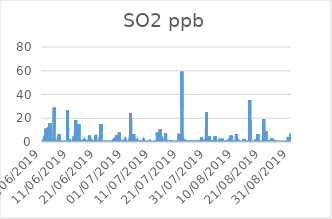
| Category | SO2 |
|---|---|
| 01/06/2019 | 0.2 |
| 01/06/2019 | 0.1 |
| 01/06/2019 | 0.1 |
| 01/06/2019 | 0.1 |
| 01/06/2019 | 0.1 |
| 01/06/2019 | 0.1 |
| 01/06/2019 | 0.2 |
| 01/06/2019 | 0.4 |
| 01/06/2019 | 0.6 |
| 01/06/2019 | 0.9 |
| 01/06/2019 | 0.6 |
| 01/06/2019 | 0.3 |
| 01/06/2019 | 0.3 |
| 01/06/2019 | 0.3 |
| 01/06/2019 | 0.3 |
| 01/06/2019 | 0.3 |
| 01/06/2019 | 0.4 |
| 01/06/2019 | 0.5 |
| 01/06/2019 | 0.4 |
| 01/06/2019 | 1.5 |
| 01/06/2019 | 1.7 |
| 01/06/2019 | 1 |
| 01/06/2019 | 1.2 |
| 01/06/2019 | 1.6 |
| 02/06/2019 | 0.6 |
| 02/06/2019 | 0.6 |
| 02/06/2019 | 1.6 |
| 02/06/2019 | 1 |
| 02/06/2019 | 0.6 |
| 02/06/2019 | 0.5 |
| 02/06/2019 | 0.8 |
| 02/06/2019 | 1.1 |
| 02/06/2019 | 0.8 |
| 02/06/2019 | 6.3 |
| 02/06/2019 | 11.4 |
| 02/06/2019 | 2.9 |
| 02/06/2019 | 0.6 |
| 02/06/2019 | 0.5 |
| 02/06/2019 | 0.3 |
| 02/06/2019 | 0.4 |
| 02/06/2019 | 0.5 |
| 02/06/2019 | 0.7 |
| 02/06/2019 | 0.7 |
| 02/06/2019 | 0.4 |
| 02/06/2019 | 0.4 |
| 02/06/2019 | 1.2 |
| 02/06/2019 | 0.5 |
| 02/06/2019 | 0.4 |
| 03/06/2019 | 0.4 |
| 03/06/2019 | 0.4 |
| 03/06/2019 | 0.3 |
| 03/06/2019 | 0.5 |
| 03/06/2019 | 0.4 |
| 03/06/2019 | 0.3 |
| 03/06/2019 | 0.4 |
| 03/06/2019 | 0.9 |
| 03/06/2019 | 12.4 |
| 03/06/2019 | 2 |
| 03/06/2019 | 0.5 |
| 03/06/2019 | 0.2 |
| 03/06/2019 | 0.2 |
| 03/06/2019 | 9.8 |
| 03/06/2019 | 4.2 |
| 03/06/2019 | 4.9 |
| 03/06/2019 | 0.8 |
| 03/06/2019 | 0.3 |
| 03/06/2019 | 0.6 |
| 03/06/2019 | 2.8 |
| 03/06/2019 | 0.6 |
| 03/06/2019 | 0.9 |
| 03/06/2019 | 4.4 |
| 03/06/2019 | 15.9 |
| 04/06/2019 | 0.7 |
| 04/06/2019 | 0.4 |
| 04/06/2019 | 1.9 |
| 04/06/2019 | 1.3 |
| 04/06/2019 | 0.3 |
| 04/06/2019 | 0.3 |
| 04/06/2019 | 0.4 |
| 04/06/2019 | 0.5 |
| 04/06/2019 | 0.4 |
| 04/06/2019 | 0.4 |
| 04/06/2019 | 0.3 |
| 04/06/2019 | 0.3 |
| 04/06/2019 | 0.2 |
| 04/06/2019 | 0.1 |
| 04/06/2019 | 0.1 |
| 04/06/2019 | 0.1 |
| 04/06/2019 | 0.1 |
| 04/06/2019 | 0.1 |
| 04/06/2019 | 0.1 |
| 04/06/2019 | 0.1 |
| 04/06/2019 | 0.1 |
| 04/06/2019 | 0.2 |
| 04/06/2019 | 0.9 |
| 04/06/2019 | 1.3 |
| 05/06/2019 | 0.4 |
| 05/06/2019 | 0.4 |
| 05/06/2019 | 0.8 |
| 05/06/2019 | 1 |
| 05/06/2019 | 0.9 |
| 05/06/2019 | 0.6 |
| 05/06/2019 | 0.5 |
| 05/06/2019 | 0.7 |
| 05/06/2019 | 0.5 |
| 05/06/2019 | 1 |
| 05/06/2019 | 0.4 |
| 05/06/2019 | 29 |
| 05/06/2019 | 10.6 |
| 05/06/2019 | 0.2 |
| 05/06/2019 | 0.5 |
| 05/06/2019 | 0.3 |
| 05/06/2019 | 0.3 |
| 05/06/2019 | 0.2 |
| 05/06/2019 | 0.3 |
| 05/06/2019 | 0.2 |
| 05/06/2019 | 0.2 |
| 05/06/2019 | 0.2 |
| 05/06/2019 | 0.2 |
| 05/06/2019 | 0.7 |
| 06/06/2019 | 1.5 |
| 06/06/2019 | 1.5 |
| 06/06/2019 | 0.6 |
| 06/06/2019 | 0.5 |
| 06/06/2019 | 1 |
| 06/06/2019 | 0.7 |
| 06/06/2019 | 0.7 |
| 06/06/2019 | 0.7 |
| 06/06/2019 | 0.3 |
| 06/06/2019 | 0.2 |
| 06/06/2019 | 0.3 |
| 06/06/2019 | 0.3 |
| 06/06/2019 | 0.2 |
| 06/06/2019 | 0.2 |
| 06/06/2019 | 0.2 |
| 06/06/2019 | 0.2 |
| 06/06/2019 | 0.6 |
| 06/06/2019 | 0.8 |
| 06/06/2019 | 0.7 |
| 06/06/2019 | 1.2 |
| 06/06/2019 | 0.8 |
| 06/06/2019 | 1.7 |
| 06/06/2019 | 2.8 |
| 06/06/2019 | 3 |
| 07/06/2019 | 3.8 |
| 07/06/2019 | 4.5 |
| 07/06/2019 | 0.5 |
| 07/06/2019 | 0.4 |
| 07/06/2019 | 0.6 |
| 07/06/2019 | 0.7 |
| 07/06/2019 | 1.1 |
| 07/06/2019 | 0.9 |
| 07/06/2019 | 6.5 |
| 07/06/2019 | 1.6 |
| 07/06/2019 | 1.1 |
| 07/06/2019 | 1.5 |
| 07/06/2019 | 0.9 |
| 07/06/2019 | 0.5 |
| 07/06/2019 | 0.3 |
| 07/06/2019 | 0.4 |
| 07/06/2019 | 0.3 |
| 07/06/2019 | 0.3 |
| 07/06/2019 | 0.3 |
| 07/06/2019 | 0.2 |
| 07/06/2019 | 0.2 |
| 07/06/2019 | 0.3 |
| 07/06/2019 | 0.4 |
| 07/06/2019 | 0.4 |
| 08/06/2019 | 0.2 |
| 08/06/2019 | 0.2 |
| 08/06/2019 | 0.3 |
| 08/06/2019 | 0.2 |
| 08/06/2019 | 0.1 |
| 08/06/2019 | 0 |
| 08/06/2019 | 0 |
| 08/06/2019 | 0.1 |
| 08/06/2019 | 0.1 |
| 08/06/2019 | 0.1 |
| 08/06/2019 | 0.1 |
| 08/06/2019 | 0.1 |
| 08/06/2019 | 0.1 |
| 08/06/2019 | 0.1 |
| 08/06/2019 | 0.1 |
| 08/06/2019 | 0.1 |
| 08/06/2019 | 0.2 |
| 08/06/2019 | 0.1 |
| 08/06/2019 | 0.1 |
| 08/06/2019 | 0.1 |
| 08/06/2019 | 0.1 |
| 08/06/2019 | 0.1 |
| 08/06/2019 | 0.2 |
| 08/06/2019 | 0.4 |
| 09/06/2019 | 0.4 |
| 09/06/2019 | 0.3 |
| 09/06/2019 | 0.4 |
| 09/06/2019 | 0.5 |
| 09/06/2019 | 0.3 |
| 09/06/2019 | 0.1 |
| 09/06/2019 | 0.2 |
| 09/06/2019 | 0.3 |
| 09/06/2019 | 0.4 |
| 09/06/2019 | 0.2 |
| 09/06/2019 | 0.3 |
| 09/06/2019 | 1.2 |
| 09/06/2019 | 0.9 |
| 09/06/2019 | 0.4 |
| 09/06/2019 | 0.2 |
| 09/06/2019 | 0.2 |
| 09/06/2019 | 0.2 |
| 09/06/2019 | 0.2 |
| 09/06/2019 | 0.2 |
| 09/06/2019 | 0.1 |
| 09/06/2019 | 0.2 |
| 09/06/2019 | 0.1 |
| 09/06/2019 | 0.2 |
| 09/06/2019 | 0.2 |
| 10/06/2019 | 0.2 |
| 10/06/2019 | 0.1 |
| 10/06/2019 | 0.1 |
| 10/06/2019 | 0.1 |
| 10/06/2019 | 0.1 |
| 10/06/2019 | 0.2 |
| 10/06/2019 | 0.2 |
| 10/06/2019 | 0.3 |
| 10/06/2019 | 0.9 |
| 10/06/2019 | 26.7 |
| 10/06/2019 | 9.1 |
| 10/06/2019 | 1 |
| 10/06/2019 | 0.6 |
| 10/06/2019 | 0.5 |
| 10/06/2019 | 0.4 |
| 10/06/2019 | 0.3 |
| 10/06/2019 | 0.2 |
| 10/06/2019 | 0.2 |
| 10/06/2019 | 0.2 |
| 10/06/2019 | 0.2 |
| 10/06/2019 | 0.2 |
| 10/06/2019 | 0.2 |
| 10/06/2019 | 0.3 |
| 10/06/2019 | 0.4 |
| 11/06/2019 | 0.3 |
| 11/06/2019 | 1.4 |
| 11/06/2019 | 2.6 |
| 11/06/2019 | 0.8 |
| 11/06/2019 | 0.4 |
| 11/06/2019 | 0.3 |
| 11/06/2019 | 0.8 |
| 11/06/2019 | 0.6 |
| 11/06/2019 | 0.6 |
| 11/06/2019 | 0.5 |
| 11/06/2019 | 0.4 |
| 11/06/2019 | 0.4 |
| 11/06/2019 | 0.3 |
| 11/06/2019 | 0.3 |
| 11/06/2019 | 0.3 |
| 11/06/2019 | 0.2 |
| 11/06/2019 | 0.2 |
| 11/06/2019 | 0.2 |
| 11/06/2019 | 0.2 |
| 11/06/2019 | 0.3 |
| 11/06/2019 | 0.3 |
| 11/06/2019 | 0.2 |
| 11/06/2019 | 0.3 |
| 11/06/2019 | 0.3 |
| 12/06/2019 | 0.3 |
| 12/06/2019 | 0.4 |
| 12/06/2019 | 0.4 |
| 12/06/2019 | 0.3 |
| 12/06/2019 | 0.3 |
| 12/06/2019 | 0.2 |
| 12/06/2019 | 0.3 |
| 12/06/2019 | 0.8 |
| 12/06/2019 | 0.9 |
| 12/06/2019 | 0.5 |
| 12/06/2019 | 0.2 |
| 12/06/2019 | 0.2 |
| 12/06/2019 | 0.3 |
| 12/06/2019 | 0.3 |
| 12/06/2019 | 0.4 |
| 12/06/2019 | 0.4 |
| 12/06/2019 | 0.3 |
| 12/06/2019 | 0.3 |
| 12/06/2019 | 4.7 |
| 12/06/2019 | 0.5 |
| 12/06/2019 | 0.7 |
| 12/06/2019 | 1 |
| 12/06/2019 | 0.9 |
| 12/06/2019 | 0.5 |
| 13/06/2019 | 0.4 |
| 13/06/2019 | 0.3 |
| 13/06/2019 | 0.3 |
| 13/06/2019 | 0.2 |
| 13/06/2019 | 0.2 |
| 13/06/2019 | 0.2 |
| 13/06/2019 | 0.5 |
| 13/06/2019 | 0.9 |
| 13/06/2019 | 14.3 |
| 13/06/2019 | 18.5 |
| 13/06/2019 | 4.6 |
| 13/06/2019 | 12.2 |
| 13/06/2019 | 12.5 |
| 13/06/2019 | 1.2 |
| 13/06/2019 | 1 |
| 13/06/2019 | 0.7 |
| 13/06/2019 | 0.4 |
| 13/06/2019 | 0.4 |
| 13/06/2019 | 0.6 |
| 13/06/2019 | 0.3 |
| 13/06/2019 | 0.2 |
| 13/06/2019 | 0.5 |
| 13/06/2019 | 1 |
| 13/06/2019 | 1.5 |
| 14/06/2019 | 0.8 |
| 14/06/2019 | 0.5 |
| 14/06/2019 | 0.3 |
| 14/06/2019 | 0.2 |
| 14/06/2019 | 0.2 |
| 14/06/2019 | 0.2 |
| 14/06/2019 | 0.4 |
| 14/06/2019 | 0.9 |
| 14/06/2019 | 1.2 |
| 14/06/2019 | 1.1 |
| 14/06/2019 | 1.2 |
| 14/06/2019 | 10.4 |
| 14/06/2019 | 3.7 |
| 14/06/2019 | 6.2 |
| 14/06/2019 | 15.2 |
| 14/06/2019 | 11 |
| 14/06/2019 | 2.8 |
| 14/06/2019 | 0.6 |
| 14/06/2019 | 0.7 |
| 14/06/2019 | 1 |
| 14/06/2019 | 0.3 |
| 14/06/2019 | 0.4 |
| 14/06/2019 | 0.4 |
| 14/06/2019 | 0.2 |
| 15/06/2019 | 0.2 |
| 15/06/2019 | 0.3 |
| 15/06/2019 | 0.4 |
| 15/06/2019 | 0.2 |
| 15/06/2019 | 0.2 |
| 15/06/2019 | 0.6 |
| 15/06/2019 | 0.3 |
| 15/06/2019 | 0.3 |
| 15/06/2019 | 0.3 |
| 15/06/2019 | 0.2 |
| 15/06/2019 | 0.2 |
| 15/06/2019 | 0.3 |
| 15/06/2019 | 0.2 |
| 15/06/2019 | 0.3 |
| 15/06/2019 | 0.2 |
| 15/06/2019 | 0.1 |
| 15/06/2019 | 0.1 |
| 15/06/2019 | 0.6 |
| 15/06/2019 | 0.7 |
| 15/06/2019 | 0.4 |
| 15/06/2019 | 0.9 |
| 15/06/2019 | 0.8 |
| 15/06/2019 | 0.5 |
| 15/06/2019 | 0.9 |
| 16/06/2019 | 0.3 |
| 16/06/2019 | 0.2 |
| 16/06/2019 | 0.2 |
| 16/06/2019 | 0.2 |
| 16/06/2019 | 0.2 |
| 16/06/2019 | 0.2 |
| 16/06/2019 | 0.2 |
| 16/06/2019 | 0.3 |
| 16/06/2019 | 0.2 |
| 16/06/2019 | 0.2 |
| 16/06/2019 | 0.2 |
| 16/06/2019 | 0.2 |
| 16/06/2019 | 0.2 |
| 16/06/2019 | 0.3 |
| 16/06/2019 | 1.7 |
| 16/06/2019 | 1.5 |
| 16/06/2019 | 1.3 |
| 16/06/2019 | 1.8 |
| 16/06/2019 | 1.9 |
| 16/06/2019 | 1.3 |
| 16/06/2019 | 0.3 |
| 16/06/2019 | 0.2 |
| 16/06/2019 | 0.2 |
| 16/06/2019 | 0.2 |
| 17/06/2019 | 0.3 |
| 17/06/2019 | 0.2 |
| 17/06/2019 | 0.1 |
| 17/06/2019 | 0.1 |
| 17/06/2019 | 0.1 |
| 17/06/2019 | 0.1 |
| 17/06/2019 | 0.2 |
| 17/06/2019 | 0.2 |
| 17/06/2019 | 0.4 |
| 17/06/2019 | 0.4 |
| 17/06/2019 | 0.3 |
| 17/06/2019 | 0.2 |
| 17/06/2019 | 0.2 |
| 17/06/2019 | 0.2 |
| 17/06/2019 | 0.6 |
| 17/06/2019 | 1 |
| 17/06/2019 | 0.9 |
| 17/06/2019 | 0.5 |
| 17/06/2019 | 0.3 |
| 17/06/2019 | 0.3 |
| 17/06/2019 | 0.7 |
| 17/06/2019 | 0.5 |
| 17/06/2019 | 0.3 |
| 17/06/2019 | 0.4 |
| 18/06/2019 | 0.3 |
| 18/06/2019 | 0.2 |
| 18/06/2019 | 0.1 |
| 18/06/2019 | 0.1 |
| 18/06/2019 | 0.1 |
| 18/06/2019 | 0.1 |
| 18/06/2019 | 0.7 |
| 18/06/2019 | 0.8 |
| 18/06/2019 | 0.7 |
| 18/06/2019 | 0.5 |
| 18/06/2019 | 5.5 |
| 18/06/2019 | 5.5 |
| 18/06/2019 | 1.2 |
| 18/06/2019 | 3.7 |
| 18/06/2019 | 0.8 |
| 18/06/2019 | 2.1 |
| 18/06/2019 | 1.4 |
| 18/06/2019 | 0.8 |
| 18/06/2019 | 0.9 |
| 18/06/2019 | 0.3 |
| 18/06/2019 | 1.7 |
| 18/06/2019 | 1.1 |
| 18/06/2019 | 0.5 |
| 18/06/2019 | 0.4 |
| 19/06/2019 | 0.3 |
| 19/06/2019 | 0.3 |
| 19/06/2019 | 0.3 |
| 19/06/2019 | 0.3 |
| 19/06/2019 | 0.2 |
| 19/06/2019 | 0.2 |
| 19/06/2019 | 0.4 |
| 19/06/2019 | 0.7 |
| 19/06/2019 | 0.6 |
| 19/06/2019 | 0.4 |
| 19/06/2019 | 0.3 |
| 19/06/2019 | 0.2 |
| 19/06/2019 | 0.2 |
| 19/06/2019 | 0.1 |
| 19/06/2019 | 0.1 |
| 19/06/2019 | 0.1 |
| 19/06/2019 | 0.1 |
| 19/06/2019 | 0.1 |
| 19/06/2019 | 0.1 |
| 19/06/2019 | 0.1 |
| 19/06/2019 | 0.2 |
| 19/06/2019 | 0.1 |
| 19/06/2019 | 0.3 |
| 19/06/2019 | 0.3 |
| 20/06/2019 | 0.3 |
| 20/06/2019 | 0.3 |
| 20/06/2019 | 0.3 |
| 20/06/2019 | 0.2 |
| 20/06/2019 | 1 |
| 20/06/2019 | 1.4 |
| 20/06/2019 | 0.5 |
| 20/06/2019 | 0.2 |
| 20/06/2019 | 0.1 |
| 20/06/2019 | 0.1 |
| 20/06/2019 | 0.1 |
| 20/06/2019 | 0.2 |
| 20/06/2019 | 0.2 |
| 20/06/2019 | 0.2 |
| 20/06/2019 | 0.2 |
| 20/06/2019 | 0.2 |
| 20/06/2019 | 0.1 |
| 20/06/2019 | 0.1 |
| 20/06/2019 | 6 |
| 20/06/2019 | 1.6 |
| 20/06/2019 | 0.4 |
| 20/06/2019 | 0.8 |
| 20/06/2019 | 0.5 |
| 20/06/2019 | 0.3 |
| 21/06/2019 | 0.9 |
| 21/06/2019 | 1.2 |
| 21/06/2019 | 1.1 |
| 21/06/2019 | 0.5 |
| 21/06/2019 | 0.3 |
| 21/06/2019 | 0.2 |
| 21/06/2019 | 0.2 |
| 21/06/2019 | 0.2 |
| 21/06/2019 | 0.2 |
| 21/06/2019 | 0.3 |
| 21/06/2019 | 0.4 |
| 21/06/2019 | 0.5 |
| 21/06/2019 | 0.4 |
| 21/06/2019 | 0.2 |
| 21/06/2019 | 0.1 |
| 21/06/2019 | 0.2 |
| 21/06/2019 | 1.7 |
| 21/06/2019 | 0.3 |
| 21/06/2019 | 0.2 |
| 21/06/2019 | 0.2 |
| 21/06/2019 | 0.2 |
| 21/06/2019 | 0.1 |
| 21/06/2019 | 0.1 |
| 21/06/2019 | 0.1 |
| 22/06/2019 | 0.1 |
| 22/06/2019 | 0.1 |
| 22/06/2019 | 0.1 |
| 22/06/2019 | 0.1 |
| 22/06/2019 | 0.1 |
| 22/06/2019 | 0.1 |
| 22/06/2019 | 0.1 |
| 22/06/2019 | 0.5 |
| 22/06/2019 | 0.4 |
| 22/06/2019 | 0.2 |
| 22/06/2019 | 4.3 |
| 22/06/2019 | 4.4 |
| 22/06/2019 | 1.7 |
| 22/06/2019 | 4 |
| 22/06/2019 | 15.2 |
| 22/06/2019 | 3.1 |
| 22/06/2019 | 11.1 |
| 22/06/2019 | 10.6 |
| 22/06/2019 | 14.9 |
| 22/06/2019 | 9.6 |
| 22/06/2019 | 0.9 |
| 22/06/2019 | 0.4 |
| 22/06/2019 | 0.6 |
| 22/06/2019 | 0.6 |
| 23/06/2019 | 0.5 |
| 23/06/2019 | 0.2 |
| 23/06/2019 | 0.3 |
| 23/06/2019 | 0.3 |
| 23/06/2019 | 0.2 |
| 23/06/2019 | 0.1 |
| 23/06/2019 | 0.2 |
| 23/06/2019 | 0.4 |
| 23/06/2019 | 0.4 |
| 23/06/2019 | 0.3 |
| 23/06/2019 | 0.2 |
| 23/06/2019 | 0.2 |
| 23/06/2019 | 0.2 |
| 23/06/2019 | 0.2 |
| 23/06/2019 | 0.2 |
| 23/06/2019 | 0.2 |
| 23/06/2019 | 0.1 |
| 23/06/2019 | 0.1 |
| 23/06/2019 | 0.1 |
| 23/06/2019 | 0.2 |
| 23/06/2019 | 0.2 |
| 23/06/2019 | 0.2 |
| 23/06/2019 | 0.1 |
| 23/06/2019 | 0.1 |
| 24/06/2019 | 0.1 |
| 24/06/2019 | 0.2 |
| 24/06/2019 | 0.2 |
| 24/06/2019 | 0.2 |
| 24/06/2019 | 0.1 |
| 24/06/2019 | 0.1 |
| 24/06/2019 | 0.1 |
| 24/06/2019 | 0.3 |
| 24/06/2019 | 0.3 |
| 24/06/2019 | 0.4 |
| 24/06/2019 | 0.3 |
| 24/06/2019 | 0.5 |
| 24/06/2019 | 0.5 |
| 24/06/2019 | 0.2 |
| 24/06/2019 | 0.1 |
| 24/06/2019 | 0.2 |
| 24/06/2019 | 0.1 |
| 24/06/2019 | 0.1 |
| 24/06/2019 | 0.1 |
| 24/06/2019 | 0.1 |
| 24/06/2019 | 0.1 |
| 24/06/2019 | 0.1 |
| 24/06/2019 | 0.1 |
| 24/06/2019 | 0.1 |
| 25/06/2019 | 0.1 |
| 25/06/2019 | 0.1 |
| 25/06/2019 | 0.1 |
| 25/06/2019 | 0 |
| 25/06/2019 | 0 |
| 25/06/2019 | 0 |
| 25/06/2019 | 0.1 |
| 25/06/2019 | 0.1 |
| 25/06/2019 | 0.2 |
| 25/06/2019 | 0.2 |
| 25/06/2019 | 0.2 |
| 25/06/2019 | 0.2 |
| 25/06/2019 | 0.2 |
| 25/06/2019 | 0.2 |
| 25/06/2019 | 0.2 |
| 25/06/2019 | 0.1 |
| 25/06/2019 | 0.1 |
| 25/06/2019 | 0.1 |
| 25/06/2019 | 0.2 |
| 25/06/2019 | 0.1 |
| 25/06/2019 | 0.1 |
| 25/06/2019 | 0.1 |
| 25/06/2019 | 0.1 |
| 25/06/2019 | 0.1 |
| 26/06/2019 | 0.1 |
| 26/06/2019 | 0.1 |
| 26/06/2019 | 0.1 |
| 26/06/2019 | 0.1 |
| 26/06/2019 | 0.1 |
| 26/06/2019 | 0.1 |
| 26/06/2019 | 0.2 |
| 26/06/2019 | 0.4 |
| 26/06/2019 | 0.5 |
| 26/06/2019 | 0.5 |
| 26/06/2019 | 0.4 |
| 26/06/2019 | 0.5 |
| 26/06/2019 | 0.4 |
| 26/06/2019 | 0.4 |
| 26/06/2019 | 0.4 |
| 26/06/2019 | 0.5 |
| 26/06/2019 | 0.5 |
| 26/06/2019 | 0.3 |
| 26/06/2019 | 0.4 |
| 26/06/2019 | 0.4 |
| 26/06/2019 | 0.3 |
| 26/06/2019 | 0.3 |
| 26/06/2019 | 0.4 |
| 26/06/2019 | 0.2 |
| 27/06/2019 | 0.3 |
| 27/06/2019 | 0.4 |
| 27/06/2019 | 0.3 |
| 27/06/2019 | 0.4 |
| 27/06/2019 | 1.2 |
| 27/06/2019 | 1.2 |
| 27/06/2019 | 0.8 |
| 27/06/2019 | 0.9 |
| 27/06/2019 | 0.7 |
| 27/06/2019 | 0.7 |
| 27/06/2019 | 0.6 |
| 27/06/2019 | 0.6 |
| 27/06/2019 | 1.6 |
| 27/06/2019 | 1.4 |
| 27/06/2019 | 0.7 |
| 27/06/2019 | 0.5 |
| 27/06/2019 | 0.8 |
| 27/06/2019 | 0.4 |
| 27/06/2019 | 0.5 |
| 27/06/2019 | 1.1 |
| 27/06/2019 | 1.1 |
| 27/06/2019 | 3.4 |
| 27/06/2019 | 1.1 |
| 27/06/2019 | 0.9 |
| 28/06/2019 | 1 |
| 28/06/2019 | 0.7 |
| 28/06/2019 | 0.5 |
| 28/06/2019 | 0.1 |
| 28/06/2019 | 0.1 |
| 28/06/2019 | 0.5 |
| 28/06/2019 | 0.8 |
| 28/06/2019 | 1.3 |
| 28/06/2019 | 1.2 |
| 28/06/2019 | 5.6 |
| 28/06/2019 | 2.7 |
| 28/06/2019 | 0.6 |
| 28/06/2019 | 1 |
| 28/06/2019 | 0.3 |
| 28/06/2019 | 1.9 |
| 28/06/2019 | 5 |
| 28/06/2019 | 2.6 |
| 28/06/2019 | 1.8 |
| 28/06/2019 | 3.6 |
| 28/06/2019 | 1.3 |
| 28/06/2019 | 2.6 |
| 28/06/2019 | 3.2 |
| 28/06/2019 | 1.2 |
| 28/06/2019 | 2.1 |
| 29/06/2019 | 2.8 |
| 29/06/2019 | 2.7 |
| 29/06/2019 | 0.7 |
| 29/06/2019 | 0.2 |
| 29/06/2019 | 0.2 |
| 29/06/2019 | 0.9 |
| 29/06/2019 | 0.6 |
| 29/06/2019 | 1.3 |
| 29/06/2019 | 1.6 |
| 29/06/2019 | 6.7 |
| 29/06/2019 | 8 |
| 29/06/2019 | 8.8 |
| 29/06/2019 | 8.4 |
| 29/06/2019 | 1.2 |
| 29/06/2019 | 0.9 |
| 29/06/2019 | 0.6 |
| 29/06/2019 | 0.5 |
| 29/06/2019 | 0.3 |
| 29/06/2019 | 0.3 |
| 29/06/2019 | 0.3 |
| 29/06/2019 | 0.3 |
| 29/06/2019 | 0.2 |
| 29/06/2019 | 0.1 |
| 29/06/2019 | 0.1 |
| 30/06/2019 | 0.1 |
| 30/06/2019 | 0.1 |
| 30/06/2019 | 0.1 |
| 30/06/2019 | 0.1 |
| 30/06/2019 | 0.1 |
| 30/06/2019 | 0.1 |
| 30/06/2019 | 0.1 |
| 30/06/2019 | 0.2 |
| 30/06/2019 | 0.3 |
| 30/06/2019 | 0.2 |
| 30/06/2019 | 0.2 |
| 30/06/2019 | 0.5 |
| 30/06/2019 | 0.5 |
| 30/06/2019 | 0.3 |
| 30/06/2019 | 0.2 |
| 30/06/2019 | 0.2 |
| 30/06/2019 | 0.2 |
| 30/06/2019 | 0.2 |
| 30/06/2019 | 0.3 |
| 30/06/2019 | 0.2 |
| 30/06/2019 | 0.2 |
| 30/06/2019 | 0.2 |
| 30/06/2019 | 0.2 |
| 30/06/2019 | 0.1 |
| 01/07/2019 | 0.1 |
| 01/07/2019 | 0.1 |
| 01/07/2019 | 0.1 |
| 01/07/2019 | 0.1 |
| 01/07/2019 | 0.1 |
| 01/07/2019 | 0.1 |
| 01/07/2019 | 0.1 |
| 01/07/2019 | 0.2 |
| 01/07/2019 | 1.1 |
| 01/07/2019 | 1.8 |
| 01/07/2019 | 1.5 |
| 01/07/2019 | 0.9 |
| 01/07/2019 | 0.4 |
| 01/07/2019 | 1.9 |
| 01/07/2019 | 2 |
| 01/07/2019 | 1.3 |
| 01/07/2019 | 1.2 |
| 01/07/2019 | 0.6 |
| 01/07/2019 | 0.5 |
| 01/07/2019 | 0.4 |
| 01/07/2019 | 0.7 |
| 01/07/2019 | 0.3 |
| 01/07/2019 | 0.1 |
| 01/07/2019 | 0.1 |
| 02/07/2019 | 0.1 |
| 02/07/2019 | 0.1 |
| 02/07/2019 | 0.1 |
| 02/07/2019 | 0.1 |
| 02/07/2019 | 0.1 |
| 02/07/2019 | 0.1 |
| 02/07/2019 | 0.1 |
| 02/07/2019 | 0.1 |
| 02/07/2019 | 0.1 |
| 02/07/2019 | 0.1 |
| 02/07/2019 | 0.1 |
| 02/07/2019 | 0.1 |
| 02/07/2019 | 0.1 |
| 02/07/2019 | 0.1 |
| 02/07/2019 | 0.3 |
| 02/07/2019 | 0.2 |
| 02/07/2019 | 0.2 |
| 02/07/2019 | 0.3 |
| 02/07/2019 | 0.3 |
| 02/07/2019 | 0.3 |
| 02/07/2019 | 0.2 |
| 02/07/2019 | 0.2 |
| 02/07/2019 | 0.1 |
| 02/07/2019 | 0.1 |
| 03/07/2019 | 0.1 |
| 03/07/2019 | 0.1 |
| 03/07/2019 | 0.1 |
| 03/07/2019 | 0.1 |
| 03/07/2019 | 0.1 |
| 03/07/2019 | 0.1 |
| 03/07/2019 | 0.1 |
| 03/07/2019 | 0.2 |
| 03/07/2019 | 0.4 |
| 03/07/2019 | 0.7 |
| 03/07/2019 | 0.7 |
| 03/07/2019 | 0.3 |
| 03/07/2019 | 0.2 |
| 03/07/2019 | 6.5 |
| 03/07/2019 | 24.5 |
| 03/07/2019 | 1.1 |
| 03/07/2019 | 0.3 |
| 03/07/2019 | 0.5 |
| 03/07/2019 | 0.9 |
| 03/07/2019 | 0.2 |
| 03/07/2019 | 0.1 |
| 03/07/2019 | 0.1 |
| 03/07/2019 | 0.1 |
| 03/07/2019 | 0.1 |
| 04/07/2019 | 0.1 |
| 04/07/2019 | 0.1 |
| 04/07/2019 | 0.1 |
| 04/07/2019 | 0 |
| 04/07/2019 | 0.1 |
| 04/07/2019 | 0.1 |
| 04/07/2019 | 0.1 |
| 04/07/2019 | 0.2 |
| 04/07/2019 | 0.6 |
| 04/07/2019 | 0.9 |
| 04/07/2019 | 0.5 |
| 04/07/2019 | 0.3 |
| 04/07/2019 | 0.2 |
| 04/07/2019 | 0.2 |
| 04/07/2019 | 0.2 |
| 04/07/2019 | 0.3 |
| 04/07/2019 | 0.3 |
| 04/07/2019 | 3.6 |
| 04/07/2019 | 6.8 |
| 04/07/2019 | 0.5 |
| 04/07/2019 | 0.2 |
| 04/07/2019 | 0.2 |
| 04/07/2019 | 0.2 |
| 04/07/2019 | 0.1 |
| 05/07/2019 | 0.1 |
| 05/07/2019 | 0.1 |
| 05/07/2019 | 0.1 |
| 05/07/2019 | 0.1 |
| 05/07/2019 | 0.3 |
| 05/07/2019 | 0.1 |
| 05/07/2019 | 0.3 |
| 05/07/2019 | 0.5 |
| 05/07/2019 | 1.2 |
| 05/07/2019 | 1 |
| 05/07/2019 | 0.8 |
| 05/07/2019 | 0.5 |
| 05/07/2019 | 0.5 |
| 05/07/2019 | 0.5 |
| 05/07/2019 | 0.3 |
| 05/07/2019 | 0.3 |
| 05/07/2019 | 0.3 |
| 05/07/2019 | 0.3 |
| 05/07/2019 | 0.2 |
| 05/07/2019 | 0.2 |
| 05/07/2019 | 0.2 |
| 05/07/2019 | 0.2 |
| 05/07/2019 | 0.1 |
| 05/07/2019 | 1.5 |
| 06/07/2019 | 1.8 |
| 06/07/2019 | 0.9 |
| 06/07/2019 | 0.5 |
| 06/07/2019 | 0.6 |
| 06/07/2019 | 0.7 |
| 06/07/2019 | 0.6 |
| 06/07/2019 | 0.5 |
| 06/07/2019 | 0.6 |
| 06/07/2019 | 0.5 |
| 06/07/2019 | 0.4 |
| 06/07/2019 | 0.5 |
| 06/07/2019 | 0.4 |
| 06/07/2019 | 0.5 |
| 06/07/2019 | 0.7 |
| 06/07/2019 | 0.7 |
| 06/07/2019 | 0.6 |
| 06/07/2019 | 0.6 |
| 06/07/2019 | 0.4 |
| 06/07/2019 | 0.2 |
| 06/07/2019 | 0.2 |
| 06/07/2019 | 0.2 |
| 06/07/2019 | 0.2 |
| 06/07/2019 | 0.3 |
| 06/07/2019 | 0.3 |
| 07/07/2019 | 0.3 |
| 07/07/2019 | 0.3 |
| 07/07/2019 | 0.2 |
| 07/07/2019 | 0.2 |
| 07/07/2019 | 0.2 |
| 07/07/2019 | 0.1 |
| 07/07/2019 | 0.1 |
| 07/07/2019 | 0.2 |
| 07/07/2019 | 0.2 |
| 07/07/2019 | 0.2 |
| 07/07/2019 | 0.2 |
| 07/07/2019 | 0.2 |
| 07/07/2019 | 0.2 |
| 07/07/2019 | 0.2 |
| 07/07/2019 | 0.2 |
| 07/07/2019 | 0.3 |
| 07/07/2019 | 0.3 |
| 07/07/2019 | 0.3 |
| 07/07/2019 | 0.3 |
| 07/07/2019 | 0.2 |
| 07/07/2019 | 0.2 |
| 07/07/2019 | 0.6 |
| 07/07/2019 | 0.5 |
| 07/07/2019 | 0.3 |
| 08/07/2019 | 0.2 |
| 08/07/2019 | 0.1 |
| 08/07/2019 | 0.1 |
| 08/07/2019 | 0.1 |
| 08/07/2019 | 0.1 |
| 08/07/2019 | 0.1 |
| 08/07/2019 | 0.2 |
| 08/07/2019 | 1 |
| 08/07/2019 | 1.7 |
| 08/07/2019 | 2.5 |
| 08/07/2019 | 1.2 |
| 08/07/2019 | 0.8 |
| 08/07/2019 | 0.7 |
| 08/07/2019 | 0.6 |
| 08/07/2019 | 0.4 |
| 08/07/2019 | 0.4 |
| 08/07/2019 | 0.4 |
| 08/07/2019 | 0.3 |
| 08/07/2019 | 0.2 |
| 08/07/2019 | 0.2 |
| 08/07/2019 | 0.2 |
| 08/07/2019 | 0.1 |
| 08/07/2019 | 0.2 |
| 08/07/2019 | 0.1 |
| 09/07/2019 | 0.2 |
| 09/07/2019 | 0.3 |
| 09/07/2019 | 0.3 |
| 09/07/2019 | 0.3 |
| 09/07/2019 | 0.3 |
| 09/07/2019 | 0.3 |
| 09/07/2019 | 0.3 |
| 09/07/2019 | 0.2 |
| 09/07/2019 | 0.1 |
| 09/07/2019 | 0.3 |
| 09/07/2019 | 0.1 |
| 09/07/2019 | 0.1 |
| 09/07/2019 | 0.1 |
| 09/07/2019 | 0.1 |
| 09/07/2019 | 0.1 |
| 09/07/2019 | 0.1 |
| 09/07/2019 | 0.1 |
| 09/07/2019 | 0.1 |
| 09/07/2019 | 0.1 |
| 09/07/2019 | 0 |
| 09/07/2019 | 0.1 |
| 09/07/2019 | 0.1 |
| 09/07/2019 | 0.1 |
| 09/07/2019 | 0.1 |
| 10/07/2019 | 0.1 |
| 10/07/2019 | 0.1 |
| 10/07/2019 | 0.1 |
| 10/07/2019 | 0.1 |
| 10/07/2019 | 0.1 |
| 10/07/2019 | 0.1 |
| 10/07/2019 | 0.1 |
| 10/07/2019 | 0.1 |
| 10/07/2019 | 0.1 |
| 10/07/2019 | 0.2 |
| 10/07/2019 | 0 |
| 10/07/2019 | 0 |
| 10/07/2019 | 0 |
| 10/07/2019 | 0 |
| 10/07/2019 | 0 |
| 10/07/2019 | 0 |
| 10/07/2019 | 0 |
| 10/07/2019 | 0.9 |
| 10/07/2019 | 1.4 |
| 10/07/2019 | 0.2 |
| 10/07/2019 | 0.1 |
| 10/07/2019 | 0.1 |
| 10/07/2019 | 0.5 |
| 10/07/2019 | 0.4 |
| 11/07/2019 | 0.3 |
| 11/07/2019 | 0.2 |
| 11/07/2019 | 0.1 |
| 11/07/2019 | 0.1 |
| 11/07/2019 | 0.2 |
| 11/07/2019 | 0.1 |
| 11/07/2019 | 0.1 |
| 11/07/2019 | 0.1 |
| 11/07/2019 | 0 |
| 11/07/2019 | 0 |
| 11/07/2019 | 0 |
| 11/07/2019 | 0 |
| 11/07/2019 | 0 |
| 11/07/2019 | 0.7 |
| 11/07/2019 | 0.4 |
| 11/07/2019 | 0.2 |
| 11/07/2019 | 0.2 |
| 11/07/2019 | 0.2 |
| 11/07/2019 | 0.2 |
| 11/07/2019 | 0.2 |
| 11/07/2019 | 0.1 |
| 11/07/2019 | 0.1 |
| 11/07/2019 | 0.1 |
| 11/07/2019 | 0.1 |
| 12/07/2019 | 0.1 |
| 12/07/2019 | 0.1 |
| 12/07/2019 | 0.1 |
| 12/07/2019 | 0.1 |
| 12/07/2019 | 0.1 |
| 12/07/2019 | 0.1 |
| 12/07/2019 | 0.1 |
| 12/07/2019 | 0.2 |
| 12/07/2019 | 0.3 |
| 12/07/2019 | 0.3 |
| 12/07/2019 | 0.2 |
| 12/07/2019 | 0.2 |
| 12/07/2019 | 0.2 |
| 12/07/2019 | 0.3 |
| 12/07/2019 | 0.2 |
| 12/07/2019 | 0.2 |
| 12/07/2019 | 0.2 |
| 12/07/2019 | 0.1 |
| 12/07/2019 | 0.1 |
| 12/07/2019 | 0.1 |
| 12/07/2019 | 0.4 |
| 12/07/2019 | 0.3 |
| 12/07/2019 | 0.2 |
| 12/07/2019 | 0.2 |
| 13/07/2019 | 0.2 |
| 13/07/2019 | 0.2 |
| 13/07/2019 | 0.2 |
| 13/07/2019 | 0.1 |
| 13/07/2019 | 0.1 |
| 13/07/2019 | 0.1 |
| 13/07/2019 | 0.1 |
| 13/07/2019 | 0.4 |
| 13/07/2019 | 1.4 |
| 13/07/2019 | 3.8 |
| 13/07/2019 | 8.1 |
| 13/07/2019 | 2.9 |
| 13/07/2019 | 0.6 |
| 13/07/2019 | 0.4 |
| 13/07/2019 | 0.4 |
| 13/07/2019 | 1.5 |
| 13/07/2019 | 6.6 |
| 13/07/2019 | 1.6 |
| 13/07/2019 | 2.1 |
| 13/07/2019 | 0.3 |
| 13/07/2019 | 0.2 |
| 13/07/2019 | 0.2 |
| 13/07/2019 | 0.2 |
| 13/07/2019 | 0.3 |
| 14/07/2019 | 7.7 |
| 14/07/2019 | 0.8 |
| 14/07/2019 | 0.3 |
| 14/07/2019 | 0.2 |
| 14/07/2019 | 0.1 |
| 14/07/2019 | 0.1 |
| 14/07/2019 | 0.2 |
| 14/07/2019 | 0.2 |
| 14/07/2019 | 1.6 |
| 14/07/2019 | 0.4 |
| 14/07/2019 | 0.3 |
| 14/07/2019 | 10.9 |
| 14/07/2019 | 1.8 |
| 14/07/2019 | 10.6 |
| 14/07/2019 | 6.8 |
| 14/07/2019 | 5.6 |
| 14/07/2019 | 2.2 |
| 14/07/2019 | 5 |
| 14/07/2019 | 0.5 |
| 14/07/2019 | 0.5 |
| 14/07/2019 | 0.3 |
| 14/07/2019 | 0.2 |
| 14/07/2019 | 0.1 |
| 14/07/2019 | 0.1 |
| 15/07/2019 | 0.8 |
| 15/07/2019 | 3.7 |
| 15/07/2019 | 0.7 |
| 15/07/2019 | 0.4 |
| 15/07/2019 | 0.3 |
| 15/07/2019 | 0.5 |
| 15/07/2019 | 0.9 |
| 15/07/2019 | 0.9 |
| 15/07/2019 | 0.7 |
| 15/07/2019 | 0.6 |
| 15/07/2019 | 0.3 |
| 15/07/2019 | 0.2 |
| 15/07/2019 | 0.3 |
| 15/07/2019 | 0.2 |
| 15/07/2019 | 0.3 |
| 15/07/2019 | 0.3 |
| 15/07/2019 | 0.2 |
| 15/07/2019 | 0.2 |
| 15/07/2019 | 0.2 |
| 15/07/2019 | 0.1 |
| 15/07/2019 | 0.1 |
| 15/07/2019 | 0.1 |
| 15/07/2019 | 0.1 |
| 15/07/2019 | 0.1 |
| 16/07/2019 | 0.1 |
| 16/07/2019 | 0.1 |
| 16/07/2019 | 0.1 |
| 16/07/2019 | 0.1 |
| 16/07/2019 | 0.1 |
| 16/07/2019 | 0.1 |
| 16/07/2019 | 0.1 |
| 16/07/2019 | 0.2 |
| 16/07/2019 | 0.6 |
| 16/07/2019 | 1.8 |
| 16/07/2019 | 4.1 |
| 16/07/2019 | 7.4 |
| 16/07/2019 | 5.2 |
| 16/07/2019 | 3.2 |
| 16/07/2019 | 1.6 |
| 16/07/2019 | 1 |
| 16/07/2019 | 1.1 |
| 16/07/2019 | 1.2 |
| 16/07/2019 | 1 |
| 16/07/2019 | 0.6 |
| 16/07/2019 | 0.3 |
| 16/07/2019 | 0.5 |
| 16/07/2019 | 0.9 |
| 16/07/2019 | 0.6 |
| 17/07/2019 | 0.7 |
| 17/07/2019 | 0.7 |
| 17/07/2019 | 0.5 |
| 17/07/2019 | 0.3 |
| 17/07/2019 | 0.3 |
| 17/07/2019 | 0.2 |
| 17/07/2019 | 0.5 |
| 17/07/2019 | 0.6 |
| 17/07/2019 | 0.3 |
| 17/07/2019 | 0.3 |
| 17/07/2019 | 0.3 |
| 17/07/2019 | 0.3 |
| 17/07/2019 | 0.2 |
| 17/07/2019 | 0.2 |
| 17/07/2019 | 0.2 |
| 17/07/2019 | 0.2 |
| 17/07/2019 | 0.2 |
| 17/07/2019 | 0.3 |
| 17/07/2019 | 0.2 |
| 17/07/2019 | 0.2 |
| 17/07/2019 | 0.2 |
| 17/07/2019 | 0.1 |
| 17/07/2019 | 0.2 |
| 17/07/2019 | 0.3 |
| 18/07/2019 | 0.3 |
| 18/07/2019 | 0.3 |
| 18/07/2019 | 0.2 |
| 18/07/2019 | 0.3 |
| 18/07/2019 | 0.9 |
| 18/07/2019 | 0.7 |
| 18/07/2019 | 0.3 |
| 18/07/2019 | 0.4 |
| 18/07/2019 | 0.3 |
| 18/07/2019 | 0.2 |
| 18/07/2019 | 0.2 |
| 18/07/2019 | 0.5 |
| 18/07/2019 | 0.2 |
| 18/07/2019 | 0.2 |
| 18/07/2019 | 0.2 |
| 18/07/2019 | 0.4 |
| 18/07/2019 | 0.4 |
| 18/07/2019 | 0.3 |
| 18/07/2019 | 0.1 |
| 18/07/2019 | 0.1 |
| 18/07/2019 | 0.1 |
| 18/07/2019 | 0.1 |
| 18/07/2019 | 0.1 |
| 18/07/2019 | 0.1 |
| 19/07/2019 | 0.1 |
| 19/07/2019 | 0.1 |
| 19/07/2019 | 0.1 |
| 19/07/2019 | 0.1 |
| 19/07/2019 | 0.1 |
| 19/07/2019 | 0.1 |
| 19/07/2019 | 0.1 |
| 19/07/2019 | 0.1 |
| 19/07/2019 | 0.1 |
| 19/07/2019 | 0.1 |
| 19/07/2019 | 0.1 |
| 19/07/2019 | 0.1 |
| 19/07/2019 | 0.3 |
| 19/07/2019 | 0.6 |
| 19/07/2019 | 0.2 |
| 19/07/2019 | 0.2 |
| 19/07/2019 | 0.2 |
| 19/07/2019 | 0.3 |
| 19/07/2019 | 0.2 |
| 19/07/2019 | 0.1 |
| 19/07/2019 | 0.2 |
| 19/07/2019 | 0.1 |
| 19/07/2019 | 0.1 |
| 19/07/2019 | 0.2 |
| 20/07/2019 | 0.2 |
| 20/07/2019 | 0.1 |
| 20/07/2019 | 0.1 |
| 20/07/2019 | 0.2 |
| 20/07/2019 | 0.1 |
| 20/07/2019 | 0.1 |
| 20/07/2019 | 0.1 |
| 20/07/2019 | 0.2 |
| 20/07/2019 | 0.3 |
| 20/07/2019 | 0.3 |
| 20/07/2019 | 0.4 |
| 20/07/2019 | 0.6 |
| 20/07/2019 | 0.2 |
| 20/07/2019 | 0.2 |
| 20/07/2019 | 0.1 |
| 20/07/2019 | 0.1 |
| 20/07/2019 | 0.2 |
| 20/07/2019 | 0.2 |
| 20/07/2019 | 0.2 |
| 20/07/2019 | 0.1 |
| 20/07/2019 | 0.2 |
| 20/07/2019 | 0.2 |
| 20/07/2019 | 0.2 |
| 20/07/2019 | 0.2 |
| 21/07/2019 | 0.8 |
| 21/07/2019 | 1 |
| 21/07/2019 | 1 |
| 21/07/2019 | 0.4 |
| 21/07/2019 | 0.8 |
| 21/07/2019 | 0.9 |
| 21/07/2019 | 1.2 |
| 21/07/2019 | 1.8 |
| 21/07/2019 | 4.5 |
| 21/07/2019 | 7 |
| 21/07/2019 | 6.9 |
| 21/07/2019 | 1.3 |
| 21/07/2019 | 0.9 |
| 21/07/2019 | 0.5 |
| 21/07/2019 | 0.4 |
| 21/07/2019 | 0.3 |
| 21/07/2019 | 0.3 |
| 21/07/2019 | 0.4 |
| 21/07/2019 | 0.6 |
| 21/07/2019 | 0.5 |
| 21/07/2019 | 0.4 |
| 21/07/2019 | 0.6 |
| 21/07/2019 | 0.8 |
| 21/07/2019 | 0.4 |
| 22/07/2019 | 0.3 |
| 22/07/2019 | 0.2 |
| 22/07/2019 | 0.2 |
| 22/07/2019 | 0.1 |
| 22/07/2019 | 0.1 |
| 22/07/2019 | 0.1 |
| 22/07/2019 | 0.2 |
| 22/07/2019 | 0.5 |
| 22/07/2019 | 0.6 |
| 22/07/2019 | 2.1 |
| 22/07/2019 | 1.6 |
| 22/07/2019 | 59.3 |
| 22/07/2019 | 26.3 |
| 22/07/2019 | 22.2 |
| 22/07/2019 | 12.4 |
| 22/07/2019 | 3.1 |
| 22/07/2019 | 1 |
| 22/07/2019 | 0.8 |
| 22/07/2019 | 2 |
| 22/07/2019 | 3.1 |
| 22/07/2019 | 2.1 |
| 22/07/2019 | 1.4 |
| 22/07/2019 | 1.2 |
| 22/07/2019 | 1 |
| 23/07/2019 | 0.5 |
| 23/07/2019 | 0.5 |
| 23/07/2019 | 0.4 |
| 23/07/2019 | 0.3 |
| 23/07/2019 | 0.5 |
| 23/07/2019 | 0.5 |
| 23/07/2019 | 0.5 |
| 23/07/2019 | 0.6 |
| 23/07/2019 | 0.6 |
| 23/07/2019 | 0.5 |
| 23/07/2019 | 0.3 |
| 23/07/2019 | 0.2 |
| 23/07/2019 | 0.4 |
| 23/07/2019 | 0.3 |
| 23/07/2019 | 0.4 |
| 23/07/2019 | 0.8 |
| 23/07/2019 | 0.6 |
| 23/07/2019 | 0.5 |
| 23/07/2019 | 0.4 |
| 23/07/2019 | 0.4 |
| 23/07/2019 | 0.7 |
| 23/07/2019 | 0.9 |
| 23/07/2019 | 0.9 |
| 23/07/2019 | 0.6 |
| 24/07/2019 | 0.5 |
| 24/07/2019 | 0.5 |
| 24/07/2019 | 0.4 |
| 24/07/2019 | 0.3 |
| 24/07/2019 | 0.2 |
| 24/07/2019 | 0.2 |
| 24/07/2019 | 0.2 |
| 24/07/2019 | 0.2 |
| 24/07/2019 | 0.3 |
| 24/07/2019 | 0.3 |
| 24/07/2019 | 0.2 |
| 24/07/2019 | 0.2 |
| 24/07/2019 | 0.2 |
| 24/07/2019 | 0.5 |
| 24/07/2019 | 0.4 |
| 24/07/2019 | 0.2 |
| 24/07/2019 | 0.2 |
| 24/07/2019 | 0.1 |
| 24/07/2019 | 0.2 |
| 24/07/2019 | 0.1 |
| 24/07/2019 | 0.1 |
| 24/07/2019 | 0.1 |
| 24/07/2019 | 0.1 |
| 24/07/2019 | 0.1 |
| 25/07/2019 | 0.1 |
| 25/07/2019 | 0 |
| 25/07/2019 | 0.1 |
| 25/07/2019 | 0.1 |
| 25/07/2019 | 0.1 |
| 25/07/2019 | 0.1 |
| 25/07/2019 | 0.1 |
| 25/07/2019 | 0.2 |
| 25/07/2019 | 0.3 |
| 25/07/2019 | 0.4 |
| 25/07/2019 | 0.5 |
| 25/07/2019 | 0.9 |
| 25/07/2019 | 0.2 |
| 25/07/2019 | 0.2 |
| 25/07/2019 | 0.2 |
| 25/07/2019 | 0.7 |
| 25/07/2019 | 0.6 |
| 25/07/2019 | 0.5 |
| 25/07/2019 | 0.3 |
| 25/07/2019 | 0.2 |
| 25/07/2019 | 0.2 |
| 25/07/2019 | 0.2 |
| 25/07/2019 | 0.1 |
| 25/07/2019 | 0.1 |
| 26/07/2019 | 0.1 |
| 26/07/2019 | 0.1 |
| 26/07/2019 | 0.1 |
| 26/07/2019 | 0.1 |
| 26/07/2019 | 0.1 |
| 26/07/2019 | 0.1 |
| 26/07/2019 | 0.1 |
| 26/07/2019 | 0.1 |
| 26/07/2019 | 0.2 |
| 26/07/2019 | 0.1 |
| 26/07/2019 | 0.2 |
| 26/07/2019 | 0.3 |
| 26/07/2019 | 0.3 |
| 26/07/2019 | 0.2 |
| 26/07/2019 | 0.2 |
| 26/07/2019 | 0.1 |
| 26/07/2019 | 0.1 |
| 26/07/2019 | 0.1 |
| 26/07/2019 | 0.1 |
| 26/07/2019 | 0.1 |
| 26/07/2019 | 0.1 |
| 26/07/2019 | 0.1 |
| 26/07/2019 | 0.1 |
| 26/07/2019 | 0.1 |
| 27/07/2019 | 0.1 |
| 27/07/2019 | 0.1 |
| 27/07/2019 | 0.1 |
| 27/07/2019 | 0.1 |
| 27/07/2019 | 0.1 |
| 27/07/2019 | 0.1 |
| 27/07/2019 | 0.1 |
| 27/07/2019 | 0.2 |
| 27/07/2019 | 0.2 |
| 27/07/2019 | 0.2 |
| 27/07/2019 | 0.2 |
| 27/07/2019 | 0.2 |
| 27/07/2019 | 0.2 |
| 27/07/2019 | 0.2 |
| 27/07/2019 | 0.2 |
| 27/07/2019 | 0.2 |
| 27/07/2019 | 0.2 |
| 27/07/2019 | 0.5 |
| 27/07/2019 | 0.4 |
| 27/07/2019 | 0.2 |
| 27/07/2019 | 0.2 |
| 27/07/2019 | 0.5 |
| 27/07/2019 | 0.4 |
| 27/07/2019 | 0.2 |
| 28/07/2019 | 0.2 |
| 28/07/2019 | 0.2 |
| 28/07/2019 | 0.2 |
| 28/07/2019 | 0.2 |
| 28/07/2019 | 0.2 |
| 28/07/2019 | 0.1 |
| 28/07/2019 | 0.1 |
| 28/07/2019 | 0.2 |
| 28/07/2019 | 0.3 |
| 28/07/2019 | 0.5 |
| 28/07/2019 | 0.2 |
| 28/07/2019 | 0.1 |
| 28/07/2019 | 0.1 |
| 28/07/2019 | 0.1 |
| 28/07/2019 | 0.2 |
| 28/07/2019 | 0.1 |
| 28/07/2019 | 0.2 |
| 28/07/2019 | 0.2 |
| 28/07/2019 | 0.1 |
| 28/07/2019 | 0.1 |
| 28/07/2019 | 0.1 |
| 28/07/2019 | 0.1 |
| 28/07/2019 | 0.1 |
| 28/07/2019 | 0.1 |
| 29/07/2019 | 0.1 |
| 29/07/2019 | 0.1 |
| 29/07/2019 | 0.1 |
| 29/07/2019 | 0.1 |
| 29/07/2019 | 0.1 |
| 29/07/2019 | 0.1 |
| 29/07/2019 | 0.1 |
| 29/07/2019 | 0.2 |
| 29/07/2019 | 0.2 |
| 29/07/2019 | 0.1 |
| 29/07/2019 | 0.1 |
| 29/07/2019 | 0.1 |
| 29/07/2019 | 0.1 |
| 29/07/2019 | 0.1 |
| 29/07/2019 | 0.1 |
| 29/07/2019 | 0.2 |
| 29/07/2019 | 0.5 |
| 29/07/2019 | 3.9 |
| 29/07/2019 | 3.3 |
| 29/07/2019 | 1.7 |
| 29/07/2019 | 1 |
| 29/07/2019 | 0.9 |
| 29/07/2019 | 1.6 |
| 29/07/2019 | 2.5 |
| 30/07/2019 | 1.1 |
| 30/07/2019 | 0.7 |
| 30/07/2019 | 0.6 |
| 30/07/2019 | 0.5 |
| 30/07/2019 | 0.4 |
| 30/07/2019 | 0.4 |
| 30/07/2019 | 0.6 |
| 30/07/2019 | 1 |
| 30/07/2019 | 0.8 |
| 30/07/2019 | 0.4 |
| 30/07/2019 | 0.3 |
| 30/07/2019 | 0.3 |
| 30/07/2019 | 0.3 |
| 30/07/2019 | 0.9 |
| 30/07/2019 | 0.8 |
| 30/07/2019 | 0.3 |
| 30/07/2019 | 0.2 |
| 30/07/2019 | 0.3 |
| 30/07/2019 | 0.4 |
| 30/07/2019 | 0.8 |
| 30/07/2019 | 0.6 |
| 30/07/2019 | 0.5 |
| 30/07/2019 | 0.3 |
| 30/07/2019 | 0.2 |
| 31/07/2019 | 0.3 |
| 31/07/2019 | 0.3 |
| 31/07/2019 | 0.3 |
| 31/07/2019 | 0.2 |
| 31/07/2019 | 0.2 |
| 31/07/2019 | 0.1 |
| 31/07/2019 | 0.2 |
| 31/07/2019 | 0.2 |
| 31/07/2019 | 0.2 |
| 31/07/2019 | 2.5 |
| 31/07/2019 | 1.9 |
| 31/07/2019 | 5.7 |
| 31/07/2019 | 25.2 |
| 31/07/2019 | 3.6 |
| 31/07/2019 | 0.4 |
| 31/07/2019 | 0.2 |
| 31/07/2019 | 0.2 |
| 31/07/2019 | 0.3 |
| 31/07/2019 | 0.5 |
| 31/07/2019 | 0.6 |
| 31/07/2019 | 0.8 |
| 31/07/2019 | 0.9 |
| 31/07/2019 | 0.5 |
| 31/07/2019 | 1.1 |
| 01/08/2019 | 0.6 |
| 01/08/2019 | 0.5 |
| 01/08/2019 | 0.5 |
| 01/08/2019 | 0.4 |
| 01/08/2019 | 0.7 |
| 01/08/2019 | 0.4 |
| 01/08/2019 | 0.7 |
| 01/08/2019 | 0.6 |
| 01/08/2019 | 0.7 |
| 01/08/2019 | 0.7 |
| 01/08/2019 | 0.8 |
| 01/08/2019 | 2.6 |
| 01/08/2019 | 4 |
| 01/08/2019 | 4.9 |
| 01/08/2019 | 1.7 |
| 01/08/2019 | 0.4 |
| 01/08/2019 | 0.3 |
| 01/08/2019 | 0.2 |
| 01/08/2019 | 0.7 |
| 01/08/2019 | 0.3 |
| 01/08/2019 | 0.3 |
| 01/08/2019 | 0.8 |
| 01/08/2019 | 0.6 |
| 01/08/2019 | 0.7 |
| 02/08/2019 | 0.5 |
| 02/08/2019 | 0.4 |
| 02/08/2019 | 0.5 |
| 02/08/2019 | 0.3 |
| 02/08/2019 | 0.4 |
| 02/08/2019 | 0.2 |
| 02/08/2019 | 0.3 |
| 02/08/2019 | 0.4 |
| 02/08/2019 | 0.4 |
| 02/08/2019 | 0.5 |
| 02/08/2019 | 0.3 |
| 02/08/2019 | 0.3 |
| 02/08/2019 | 0.2 |
| 02/08/2019 | 0.2 |
| 02/08/2019 | 0.2 |
| 02/08/2019 | 0.2 |
| 02/08/2019 | 0.2 |
| 02/08/2019 | 0.2 |
| 02/08/2019 | 0.3 |
| 02/08/2019 | 0.3 |
| 02/08/2019 | 0.2 |
| 02/08/2019 | 0.2 |
| 02/08/2019 | 0.3 |
| 02/08/2019 | 0.2 |
| 03/08/2019 | 0.3 |
| 03/08/2019 | 0.6 |
| 03/08/2019 | 0.5 |
| 03/08/2019 | 0.4 |
| 03/08/2019 | 0.3 |
| 03/08/2019 | 0.2 |
| 03/08/2019 | 0.1 |
| 03/08/2019 | 0.2 |
| 03/08/2019 | 0.3 |
| 03/08/2019 | 0.3 |
| 03/08/2019 | 0.3 |
| 03/08/2019 | 0.2 |
| 03/08/2019 | 0.6 |
| 03/08/2019 | 0.2 |
| 03/08/2019 | 3.6 |
| 03/08/2019 | 0.7 |
| 03/08/2019 | 3.2 |
| 03/08/2019 | 5 |
| 03/08/2019 | 0.9 |
| 03/08/2019 | 0.2 |
| 03/08/2019 | 0.2 |
| 03/08/2019 | 0.3 |
| 03/08/2019 | 0.4 |
| 03/08/2019 | 0.2 |
| 04/08/2019 | 0.4 |
| 04/08/2019 | 0.3 |
| 04/08/2019 | 0.2 |
| 04/08/2019 | 0.2 |
| 04/08/2019 | 0.2 |
| 04/08/2019 | 0.1 |
| 04/08/2019 | 0.1 |
| 04/08/2019 | 0.2 |
| 04/08/2019 | 0.2 |
| 04/08/2019 | 0.2 |
| 04/08/2019 | 0.4 |
| 04/08/2019 | 0.4 |
| 04/08/2019 | 0.3 |
| 04/08/2019 | 0.2 |
| 04/08/2019 | 0.3 |
| 04/08/2019 | 0.4 |
| 04/08/2019 | 0.3 |
| 04/08/2019 | 0.4 |
| 04/08/2019 | 0.4 |
| 04/08/2019 | 0.4 |
| 04/08/2019 | 0.3 |
| 04/08/2019 | 0.4 |
| 04/08/2019 | 0.3 |
| 04/08/2019 | 0.3 |
| 05/08/2019 | 0.5 |
| 05/08/2019 | 0.8 |
| 05/08/2019 | 0.3 |
| 05/08/2019 | 0.2 |
| 05/08/2019 | 0.1 |
| 05/08/2019 | 0.1 |
| 05/08/2019 | 0.1 |
| 05/08/2019 | 0.2 |
| 05/08/2019 | 1 |
| 05/08/2019 | 0.7 |
| 05/08/2019 | 0.9 |
| 05/08/2019 | 0.4 |
| 05/08/2019 | 0.3 |
| 05/08/2019 | 0.2 |
| 05/08/2019 | 0.1 |
| 05/08/2019 | 0.1 |
| 05/08/2019 | 0.1 |
| 05/08/2019 | 0.1 |
| 05/08/2019 | 0.1 |
| 05/08/2019 | 0.2 |
| 05/08/2019 | 0.3 |
| 05/08/2019 | 0.2 |
| 05/08/2019 | 0.2 |
| 05/08/2019 | 0.3 |
| 06/08/2019 | 0.2 |
| 06/08/2019 | 0.1 |
| 06/08/2019 | 0.1 |
| 06/08/2019 | 0.5 |
| 06/08/2019 | 1.4 |
| 06/08/2019 | 2.8 |
| 06/08/2019 | 1.2 |
| 06/08/2019 | 0.7 |
| 06/08/2019 | 0.5 |
| 06/08/2019 | 0.5 |
| 06/08/2019 | 2.6 |
| 06/08/2019 | 0.9 |
| 06/08/2019 | 0.4 |
| 06/08/2019 | 0.4 |
| 06/08/2019 | 0.3 |
| 06/08/2019 | 0.3 |
| 06/08/2019 | 0.3 |
| 06/08/2019 | 0.2 |
| 06/08/2019 | 0.2 |
| 06/08/2019 | 0.3 |
| 06/08/2019 | 0.3 |
| 06/08/2019 | 0.2 |
| 06/08/2019 | 0.2 |
| 06/08/2019 | 0.2 |
| 07/08/2019 | 0.2 |
| 07/08/2019 | 0.2 |
| 07/08/2019 | 0.2 |
| 07/08/2019 | 0.2 |
| 07/08/2019 | 0.2 |
| 07/08/2019 | 0.2 |
| 07/08/2019 | 0.2 |
| 07/08/2019 | 0.2 |
| 07/08/2019 | 0.3 |
| 07/08/2019 | 0.3 |
| 07/08/2019 | 0.3 |
| 07/08/2019 | 0.2 |
| 07/08/2019 | 0.3 |
| 07/08/2019 | 0.2 |
| 07/08/2019 | 0.1 |
| 07/08/2019 | 0.1 |
| 07/08/2019 | 0.1 |
| 07/08/2019 | 0.1 |
| 07/08/2019 | 0.1 |
| 07/08/2019 | 0.1 |
| 07/08/2019 | 0.1 |
| 07/08/2019 | 0.5 |
| 07/08/2019 | 0.4 |
| 07/08/2019 | 0.3 |
| 08/08/2019 | 0.6 |
| 08/08/2019 | 0.3 |
| 08/08/2019 | 0.1 |
| 08/08/2019 | 0.1 |
| 08/08/2019 | 0.1 |
| 08/08/2019 | 0.1 |
| 08/08/2019 | 0.2 |
| 08/08/2019 | 0.3 |
| 08/08/2019 | 1 |
| 08/08/2019 | 1.5 |
| 08/08/2019 | 0.8 |
| 08/08/2019 | 0.5 |
| 08/08/2019 | 0.5 |
| 08/08/2019 | 0.4 |
| 08/08/2019 | 0.3 |
| 08/08/2019 | 1.4 |
| 08/08/2019 | 0.3 |
| 08/08/2019 | 0.3 |
| 08/08/2019 | 0.4 |
| 08/08/2019 | 0.4 |
| 08/08/2019 | 0.3 |
| 08/08/2019 | 0.6 |
| 08/08/2019 | 1.4 |
| 08/08/2019 | 1.7 |
| 09/08/2019 | 2 |
| 09/08/2019 | 1.9 |
| 09/08/2019 | 1.1 |
| 09/08/2019 | 0.9 |
| 09/08/2019 | 0.8 |
| 09/08/2019 | 0.5 |
| 09/08/2019 | 0.6 |
| 09/08/2019 | 1.1 |
| 09/08/2019 | 1.2 |
| 09/08/2019 | 1.8 |
| 09/08/2019 | 1.8 |
| 09/08/2019 | 2.5 |
| 09/08/2019 | 5.3 |
| 09/08/2019 | 3 |
| 09/08/2019 | 5.2 |
| 09/08/2019 | 0.7 |
| 09/08/2019 | 0.4 |
| 09/08/2019 | 0.3 |
| 09/08/2019 | 0.3 |
| 09/08/2019 | 0.3 |
| 09/08/2019 | 0.3 |
| 09/08/2019 | 0.3 |
| 09/08/2019 | 0.4 |
| 09/08/2019 | 0.4 |
| 10/08/2019 | 0.3 |
| 10/08/2019 | 0.4 |
| 10/08/2019 | 0.4 |
| 10/08/2019 | 0.4 |
| 10/08/2019 | 0.2 |
| 10/08/2019 | 0.1 |
| 10/08/2019 | 0.1 |
| 10/08/2019 | 0.1 |
| 10/08/2019 | 0.1 |
| 10/08/2019 | 0.1 |
| 10/08/2019 | 0.2 |
| 10/08/2019 | 0.3 |
| 10/08/2019 | 1.3 |
| 10/08/2019 | 0.4 |
| 10/08/2019 | 0.1 |
| 10/08/2019 | 0.1 |
| 10/08/2019 | 0.1 |
| 10/08/2019 | 0.1 |
| 10/08/2019 | 0.1 |
| 10/08/2019 | 0.1 |
| 10/08/2019 | 0.1 |
| 10/08/2019 | 0.1 |
| 10/08/2019 | 0.1 |
| 10/08/2019 | 0.1 |
| 11/08/2019 | 0.1 |
| 11/08/2019 | 0.1 |
| 11/08/2019 | 0.1 |
| 11/08/2019 | 0.1 |
| 11/08/2019 | 0.1 |
| 11/08/2019 | 0.1 |
| 11/08/2019 | 0.1 |
| 11/08/2019 | 0.4 |
| 11/08/2019 | 0.3 |
| 11/08/2019 | 0.6 |
| 11/08/2019 | 0.4 |
| 11/08/2019 | 0.8 |
| 11/08/2019 | 6.5 |
| 11/08/2019 | 4.4 |
| 11/08/2019 | 4.1 |
| 11/08/2019 | 4.9 |
| 11/08/2019 | 4.3 |
| 11/08/2019 | 1.5 |
| 11/08/2019 | 0.5 |
| 11/08/2019 | 0.5 |
| 11/08/2019 | 0.4 |
| 11/08/2019 | 0.3 |
| 11/08/2019 | 0.2 |
| 11/08/2019 | 0.3 |
| 12/08/2019 | 0.4 |
| 12/08/2019 | 0.5 |
| 12/08/2019 | 0.6 |
| 12/08/2019 | 1 |
| 12/08/2019 | 0.3 |
| 12/08/2019 | 0.2 |
| 12/08/2019 | 0.6 |
| 12/08/2019 | 0.8 |
| 12/08/2019 | 0.4 |
| 12/08/2019 | 0.2 |
| 12/08/2019 | 0.2 |
| 12/08/2019 | 0.2 |
| 12/08/2019 | 0.2 |
| 12/08/2019 | 0.1 |
| 12/08/2019 | 0.1 |
| 12/08/2019 | 0.1 |
| 12/08/2019 | 0.1 |
| 12/08/2019 | 0.1 |
| 12/08/2019 | 0.1 |
| 12/08/2019 | 0.1 |
| 12/08/2019 | 0 |
| 12/08/2019 | 0.1 |
| 12/08/2019 | 0.1 |
| 12/08/2019 | 0.1 |
| 13/08/2019 | 0.1 |
| 13/08/2019 | 0.1 |
| 13/08/2019 | 0.1 |
| 13/08/2019 | 0.1 |
| 13/08/2019 | 0.1 |
| 13/08/2019 | 0.1 |
| 13/08/2019 | 0.1 |
| 13/08/2019 | 0.1 |
| 13/08/2019 | 0.1 |
| 13/08/2019 | 0.1 |
| 13/08/2019 | 0.2 |
| 13/08/2019 | 0.2 |
| 13/08/2019 | 0.2 |
| 13/08/2019 | 0.2 |
| 13/08/2019 | 0.1 |
| 13/08/2019 | 0.1 |
| 13/08/2019 | 0.1 |
| 13/08/2019 | 0.1 |
| 13/08/2019 | 0.1 |
| 13/08/2019 | 0.1 |
| 13/08/2019 | 0.1 |
| 13/08/2019 | 0.1 |
| 13/08/2019 | 0.1 |
| 13/08/2019 | 0.1 |
| 14/08/2019 | 0.1 |
| 14/08/2019 | 0.1 |
| 14/08/2019 | 0.1 |
| 14/08/2019 | 0.1 |
| 14/08/2019 | 0.2 |
| 14/08/2019 | 1.1 |
| 14/08/2019 | 0.5 |
| 14/08/2019 | 2.6 |
| 14/08/2019 | 0.4 |
| 14/08/2019 | 0.3 |
| 14/08/2019 | 0.3 |
| 14/08/2019 | 0.2 |
| 14/08/2019 | 0.2 |
| 14/08/2019 | 0.3 |
| 14/08/2019 | 0.4 |
| 14/08/2019 | 1.2 |
| 14/08/2019 | 0.1 |
| 14/08/2019 | 0.2 |
| 14/08/2019 | 0.1 |
| 14/08/2019 | 0.1 |
| 14/08/2019 | 0.1 |
| 14/08/2019 | 0.1 |
| 14/08/2019 | 0.3 |
| 14/08/2019 | 0.1 |
| 15/08/2019 | 0.1 |
| 15/08/2019 | 0.1 |
| 15/08/2019 | 0.1 |
| 15/08/2019 | 0.1 |
| 15/08/2019 | 0.1 |
| 15/08/2019 | 0.1 |
| 15/08/2019 | 0.1 |
| 15/08/2019 | 0.1 |
| 15/08/2019 | 0.3 |
| 15/08/2019 | 0.4 |
| 15/08/2019 | 0.3 |
| 15/08/2019 | 0.2 |
| 15/08/2019 | 0.4 |
| 15/08/2019 | 0.4 |
| 15/08/2019 | 0.3 |
| 15/08/2019 | 0.2 |
| 15/08/2019 | 0.1 |
| 15/08/2019 | 0.1 |
| 15/08/2019 | 0.1 |
| 15/08/2019 | 0.1 |
| 15/08/2019 | 0.1 |
| 15/08/2019 | 0.1 |
| 15/08/2019 | 0.1 |
| 15/08/2019 | 0.1 |
| 16/08/2019 | 0.1 |
| 16/08/2019 | 0.1 |
| 16/08/2019 | 0.1 |
| 16/08/2019 | 0.1 |
| 16/08/2019 | 0.1 |
| 16/08/2019 | 0.1 |
| 16/08/2019 | 0.1 |
| 16/08/2019 | 0.2 |
| 16/08/2019 | 2.3 |
| 16/08/2019 | 17.7 |
| 16/08/2019 | 35.4 |
| 16/08/2019 | 13.4 |
| 16/08/2019 | 0.5 |
| 16/08/2019 | 18.6 |
| 16/08/2019 | 2.5 |
| 16/08/2019 | 0.2 |
| 16/08/2019 | 0.2 |
| 16/08/2019 | 0.2 |
| 16/08/2019 | 0.5 |
| 16/08/2019 | 0.4 |
| 16/08/2019 | 0.3 |
| 16/08/2019 | 0.2 |
| 16/08/2019 | 0.1 |
| 16/08/2019 | 0.2 |
| 17/08/2019 | 0.2 |
| 17/08/2019 | 0.1 |
| 17/08/2019 | 0.2 |
| 17/08/2019 | 0.2 |
| 17/08/2019 | 0.2 |
| 17/08/2019 | 0.1 |
| 17/08/2019 | 0.2 |
| 17/08/2019 | 0.1 |
| 17/08/2019 | 0.1 |
| 17/08/2019 | 0.2 |
| 17/08/2019 | 0.2 |
| 17/08/2019 | 0.3 |
| 17/08/2019 | 0.2 |
| 17/08/2019 | 0.1 |
| 17/08/2019 | 0.1 |
| 17/08/2019 | 0.1 |
| 17/08/2019 | 0.1 |
| 17/08/2019 | 0.1 |
| 17/08/2019 | 0.1 |
| 17/08/2019 | 0.1 |
| 17/08/2019 | 0.1 |
| 17/08/2019 | 0.1 |
| 17/08/2019 | 0.1 |
| 17/08/2019 | 0.2 |
| 18/08/2019 | 0.1 |
| 18/08/2019 | 0.1 |
| 18/08/2019 | 0.1 |
| 18/08/2019 | 0.1 |
| 18/08/2019 | 0.1 |
| 18/08/2019 | 0.1 |
| 18/08/2019 | 0.1 |
| 18/08/2019 | 0.1 |
| 18/08/2019 | 0.1 |
| 18/08/2019 | 0.1 |
| 18/08/2019 | 0.1 |
| 18/08/2019 | 0.1 |
| 18/08/2019 | 0.1 |
| 18/08/2019 | 0.1 |
| 18/08/2019 | 0.1 |
| 18/08/2019 | 0.1 |
| 18/08/2019 | 0.1 |
| 18/08/2019 | 2.5 |
| 18/08/2019 | 0.1 |
| 18/08/2019 | 0.1 |
| 18/08/2019 | 0.9 |
| 18/08/2019 | 0.4 |
| 18/08/2019 | 0.1 |
| 18/08/2019 | 0.1 |
| 19/08/2019 | 0.1 |
| 19/08/2019 | 0.1 |
| 19/08/2019 | 0.1 |
| 19/08/2019 | 0.1 |
| 19/08/2019 | 0.1 |
| 19/08/2019 | 0.1 |
| 19/08/2019 | 0.1 |
| 19/08/2019 | 0.2 |
| 19/08/2019 | 0.4 |
| 19/08/2019 | 3.9 |
| 19/08/2019 | 6.7 |
| 19/08/2019 | 0.9 |
| 19/08/2019 | 0.5 |
| 19/08/2019 | 0.3 |
| 19/08/2019 | 0.4 |
| 19/08/2019 | 1.3 |
| 19/08/2019 | 0.5 |
| 19/08/2019 | 0.2 |
| 19/08/2019 | 0.2 |
| 19/08/2019 | 0.4 |
| 19/08/2019 | 0.3 |
| 19/08/2019 | 0.3 |
| 19/08/2019 | 0.3 |
| 19/08/2019 | 0.2 |
| 20/08/2019 | 0.1 |
| 20/08/2019 | 0.2 |
| 20/08/2019 | 0.1 |
| 20/08/2019 | 0.1 |
| 20/08/2019 | 0.2 |
| 20/08/2019 | 0.1 |
| 20/08/2019 | 0.1 |
| 20/08/2019 | 0.2 |
| 20/08/2019 | 0.2 |
| 20/08/2019 | 0.2 |
| 20/08/2019 | 0.2 |
| 20/08/2019 | 0.2 |
| 20/08/2019 | 0.2 |
| 20/08/2019 | 0.2 |
| 20/08/2019 | 0.2 |
| 20/08/2019 | 0.1 |
| 20/08/2019 | 0.2 |
| 20/08/2019 | 0.3 |
| 20/08/2019 | 0.2 |
| 20/08/2019 | 0.2 |
| 20/08/2019 | 0.1 |
| 20/08/2019 | 0.2 |
| 20/08/2019 | 0.4 |
| 20/08/2019 | 0.2 |
| 21/08/2019 | 0.1 |
| 21/08/2019 | 0.1 |
| 21/08/2019 | 0.1 |
| 21/08/2019 | 0.1 |
| 21/08/2019 | 0.1 |
| 21/08/2019 | 0.1 |
| 21/08/2019 | 0.2 |
| 21/08/2019 | 0.2 |
| 21/08/2019 | 0.7 |
| 21/08/2019 | 1.4 |
| 21/08/2019 | 1.1 |
| 21/08/2019 | 0.9 |
| 21/08/2019 | 1.8 |
| 21/08/2019 | 5.7 |
| 21/08/2019 | 19.3 |
| 21/08/2019 | 7.5 |
| 21/08/2019 | 2.3 |
| 21/08/2019 | 0.8 |
| 21/08/2019 | 0.6 |
| 21/08/2019 | 1.5 |
| 21/08/2019 | 1.4 |
| 21/08/2019 | 1.1 |
| 21/08/2019 | 1.8 |
| 21/08/2019 | 1.4 |
| 22/08/2019 | 0.7 |
| 22/08/2019 | 1.3 |
| 22/08/2019 | 0.7 |
| 22/08/2019 | 0.4 |
| 22/08/2019 | 0.3 |
| 22/08/2019 | 0.2 |
| 22/08/2019 | 0.3 |
| 22/08/2019 | 1.5 |
| 22/08/2019 | 4 |
| 22/08/2019 | 9.2 |
| 22/08/2019 | 9.3 |
| 22/08/2019 | 3.2 |
| 22/08/2019 | 1.1 |
| 22/08/2019 | 0.5 |
| 22/08/2019 | 0.4 |
| 22/08/2019 | 0.4 |
| 22/08/2019 | 0.3 |
| 22/08/2019 | 0.4 |
| 22/08/2019 | 0.4 |
| 22/08/2019 | 0.5 |
| 22/08/2019 | 0.8 |
| 22/08/2019 | 0.8 |
| 22/08/2019 | 0.4 |
| 22/08/2019 | 0.4 |
| 23/08/2019 | 0.5 |
| 23/08/2019 | 0.3 |
| 23/08/2019 | 0.3 |
| 23/08/2019 | 0.5 |
| 23/08/2019 | 0.6 |
| 23/08/2019 | 0.5 |
| 23/08/2019 | 0.6 |
| 23/08/2019 | 0.4 |
| 23/08/2019 | 0.4 |
| 23/08/2019 | 0.3 |
| 23/08/2019 | 0.3 |
| 23/08/2019 | 0.2 |
| 23/08/2019 | 0.2 |
| 23/08/2019 | 0.3 |
| 23/08/2019 | 0.5 |
| 23/08/2019 | 0.5 |
| 23/08/2019 | 0.3 |
| 23/08/2019 | 0.2 |
| 23/08/2019 | 0.2 |
| 23/08/2019 | 0.2 |
| 23/08/2019 | 0.2 |
| 23/08/2019 | 0.1 |
| 23/08/2019 | 0.2 |
| 23/08/2019 | 0.2 |
| 24/08/2019 | 0.1 |
| 24/08/2019 | 0.2 |
| 24/08/2019 | 0.2 |
| 24/08/2019 | 0.1 |
| 24/08/2019 | 0.1 |
| 24/08/2019 | 0.1 |
| 24/08/2019 | 0.1 |
| 24/08/2019 | 0.1 |
| 24/08/2019 | 0.1 |
| 24/08/2019 | 0.1 |
| 24/08/2019 | 0.1 |
| 24/08/2019 | 0.1 |
| 24/08/2019 | 0.2 |
| 24/08/2019 | 3.3 |
| 24/08/2019 | 0.3 |
| 24/08/2019 | 0.2 |
| 24/08/2019 | 0.1 |
| 24/08/2019 | 0.1 |
| 24/08/2019 | 0.1 |
| 24/08/2019 | 0.1 |
| 24/08/2019 | 0.1 |
| 24/08/2019 | 0.1 |
| 24/08/2019 | 0.1 |
| 24/08/2019 | 0.2 |
| 25/08/2019 | 0.2 |
| 25/08/2019 | 0.2 |
| 25/08/2019 | 0.3 |
| 25/08/2019 | 0.2 |
| 25/08/2019 | 0.1 |
| 25/08/2019 | 0.1 |
| 25/08/2019 | 0.1 |
| 25/08/2019 | 0.1 |
| 25/08/2019 | 0.1 |
| 25/08/2019 | 0.1 |
| 25/08/2019 | 0.9 |
| 25/08/2019 | 1.8 |
| 25/08/2019 | 0.5 |
| 25/08/2019 | 0.3 |
| 25/08/2019 | 0.2 |
| 25/08/2019 | 0.3 |
| 25/08/2019 | 0.2 |
| 25/08/2019 | 0.2 |
| 25/08/2019 | 0.2 |
| 25/08/2019 | 0.1 |
| 25/08/2019 | 0.1 |
| 25/08/2019 | 0.1 |
| 25/08/2019 | 0.1 |
| 25/08/2019 | 0.1 |
| 26/08/2019 | 0.1 |
| 26/08/2019 | 0.1 |
| 26/08/2019 | 0.1 |
| 26/08/2019 | 0.2 |
| 26/08/2019 | 0.2 |
| 26/08/2019 | 0.1 |
| 26/08/2019 | 0.1 |
| 26/08/2019 | 0.2 |
| 26/08/2019 | 0.3 |
| 26/08/2019 | 0.2 |
| 26/08/2019 | 0.3 |
| 26/08/2019 | 0.3 |
| 26/08/2019 | 0.2 |
| 26/08/2019 | 0.2 |
| 26/08/2019 | 0.2 |
| 26/08/2019 | 0.2 |
| 26/08/2019 | 0.1 |
| 26/08/2019 | 0.1 |
| 26/08/2019 | 0.1 |
| 26/08/2019 | 0.1 |
| 26/08/2019 | 0.1 |
| 26/08/2019 | 0.1 |
| 26/08/2019 | 0.1 |
| 26/08/2019 | 0.1 |
| 27/08/2019 | 0.1 |
| 27/08/2019 | 0.1 |
| 27/08/2019 | 0.1 |
| 27/08/2019 | 0.1 |
| 27/08/2019 | 0.1 |
| 27/08/2019 | 0.1 |
| 27/08/2019 | 0.1 |
| 27/08/2019 | 0.1 |
| 27/08/2019 | 0.1 |
| 27/08/2019 | 0.1 |
| 27/08/2019 | 0.1 |
| 27/08/2019 | 0.1 |
| 27/08/2019 | 0.1 |
| 27/08/2019 | 0.1 |
| 27/08/2019 | 0.1 |
| 27/08/2019 | 0.1 |
| 27/08/2019 | 0.1 |
| 27/08/2019 | 0.1 |
| 27/08/2019 | 0.1 |
| 27/08/2019 | 0.1 |
| 27/08/2019 | 0.1 |
| 27/08/2019 | 0.1 |
| 27/08/2019 | 0.1 |
| 27/08/2019 | 0.1 |
| 28/08/2019 | 0.1 |
| 28/08/2019 | 0.1 |
| 28/08/2019 | 0.1 |
| 28/08/2019 | 0.1 |
| 28/08/2019 | 0.1 |
| 28/08/2019 | 0.1 |
| 28/08/2019 | 0.1 |
| 28/08/2019 | 0.1 |
| 28/08/2019 | 0.1 |
| 28/08/2019 | 0.3 |
| 28/08/2019 | 0.2 |
| 28/08/2019 | 0.3 |
| 28/08/2019 | 0.2 |
| 28/08/2019 | 0.1 |
| 28/08/2019 | 0.3 |
| 28/08/2019 | 0.7 |
| 28/08/2019 | 0.2 |
| 28/08/2019 | 0.2 |
| 28/08/2019 | 0.1 |
| 28/08/2019 | 0.1 |
| 28/08/2019 | 0.1 |
| 28/08/2019 | 0.1 |
| 28/08/2019 | 0.1 |
| 28/08/2019 | 0.1 |
| 29/08/2019 | 0.1 |
| 29/08/2019 | 0.1 |
| 29/08/2019 | 0.1 |
| 29/08/2019 | 0.1 |
| 29/08/2019 | 0.1 |
| 29/08/2019 | 0.1 |
| 29/08/2019 | 0.1 |
| 29/08/2019 | 0.2 |
| 29/08/2019 | 0.2 |
| 29/08/2019 | 0.2 |
| 29/08/2019 | 0.1 |
| 29/08/2019 | 0.1 |
| 29/08/2019 | 0.1 |
| 29/08/2019 | 0.1 |
| 29/08/2019 | 0.1 |
| 29/08/2019 | 0.1 |
| 29/08/2019 | 0.1 |
| 29/08/2019 | 0.1 |
| 29/08/2019 | 0.1 |
| 29/08/2019 | 0.1 |
| 29/08/2019 | 0.2 |
| 29/08/2019 | 0.2 |
| 29/08/2019 | 0.1 |
| 29/08/2019 | 0.1 |
| 30/08/2019 | 0.1 |
| 30/08/2019 | 0.1 |
| 30/08/2019 | 0.1 |
| 30/08/2019 | 0.1 |
| 30/08/2019 | 0.1 |
| 30/08/2019 | 0.1 |
| 30/08/2019 | 0.1 |
| 30/08/2019 | 0.3 |
| 30/08/2019 | 0.3 |
| 30/08/2019 | 0.5 |
| 30/08/2019 | 0.6 |
| 30/08/2019 | 0.8 |
| 30/08/2019 | 0.5 |
| 30/08/2019 | 0.2 |
| 30/08/2019 | 0.2 |
| 30/08/2019 | 4.3 |
| 30/08/2019 | 1.3 |
| 30/08/2019 | 0.4 |
| 30/08/2019 | 0.9 |
| 30/08/2019 | 0.7 |
| 30/08/2019 | 1.4 |
| 30/08/2019 | 0.9 |
| 30/08/2019 | 0.5 |
| 30/08/2019 | 0.3 |
| 31/08/2019 | 0.2 |
| 31/08/2019 | 0.2 |
| 31/08/2019 | 0.3 |
| 31/08/2019 | 0.4 |
| 31/08/2019 | 0.3 |
| 31/08/2019 | 0.4 |
| 31/08/2019 | 0.4 |
| 31/08/2019 | 0.7 |
| 31/08/2019 | 0.8 |
| 31/08/2019 | 0.6 |
| 31/08/2019 | 0.4 |
| 31/08/2019 | 0.3 |
| 31/08/2019 | 0.2 |
| 31/08/2019 | 0.2 |
| 31/08/2019 | 0.2 |
| 31/08/2019 | 0.1 |
| 31/08/2019 | 7.3 |
| 31/08/2019 | 0.9 |
| 31/08/2019 | 0.2 |
| 31/08/2019 | 0.2 |
| 31/08/2019 | 0.2 |
| 31/08/2019 | 0.2 |
| 31/08/2019 | 0.3 |
| 31/08/2019 | 0.4 |